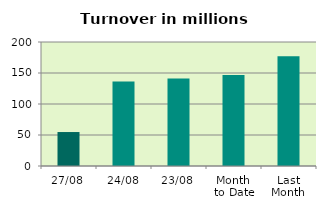
| Category | Series 0 |
|---|---|
| 27/08 | 54.792 |
| 24/08 | 136.098 |
| 23/08 | 140.947 |
| Month 
to Date | 146.935 |
| Last
Month | 177.022 |